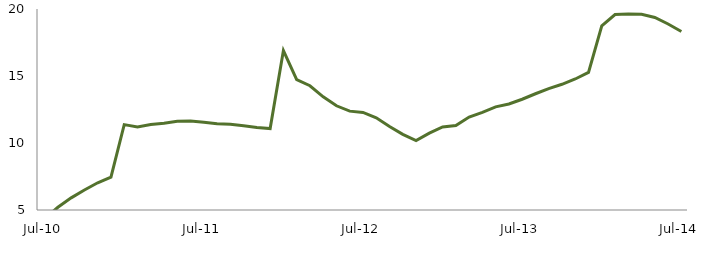
| Category | Series 0 |
|---|---|
| Jul-10 | 4.36 |
|  | 5.202 |
|  | 5.906 |
|  | 6.496 |
|  | 7.032 |
|  | 7.452 |
|  | 11.37 |
|  | 11.198 |
|  | 11.376 |
|  | 11.48 |
|  | 11.628 |
|  | 11.638 |
| Jul-11 | 11.549 |
|  | 11.441 |
|  | 11.392 |
|  | 11.289 |
|  | 11.163 |
|  | 11.08 |
|  | 16.903 |
|  | 14.732 |
|  | 14.273 |
|  | 13.449 |
|  | 12.778 |
|  | 12.379 |
| Jul-12 | 12.281 |
|  | 11.878 |
|  | 11.225 |
|  | 10.643 |
|  | 10.175 |
|  | 10.732 |
|  | 11.199 |
|  | 11.297 |
|  | 11.935 |
|  | 12.289 |
|  | 12.699 |
|  | 12.911 |
| Jul-13 | 13.266 |
|  | 13.675 |
|  | 14.064 |
|  | 14.382 |
|  | 14.778 |
|  | 15.268 |
|  | 18.737 |
|  | 19.583 |
|  | 19.624 |
|  | 19.606 |
|  | 19.369 |
|  | 18.883 |
| Jul-14 | 18.323 |